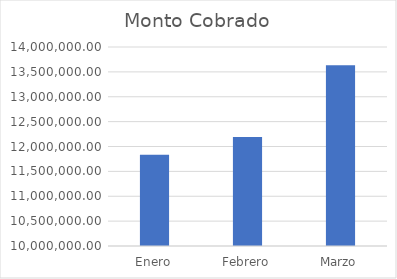
| Category | Monto Cobrado |
|---|---|
| Enero | 11833174 |
| Febrero | 12189551.8 |
| Marzo | 13634458.45 |